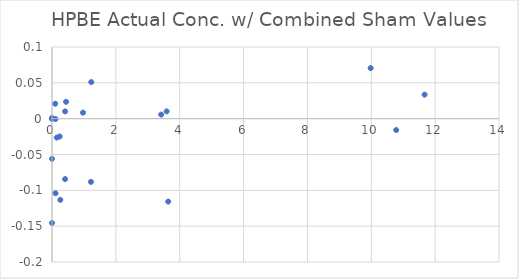
| Category | HPBE Actual Conc. w/ Combined Sham Values |
|---|---|
| 11.67 | 0.034 |
| 3.42 | 0.006 |
| 0.97 | 0.008 |
| 0.41 | 0.01 |
| 0.15 | -0.026 |
| 0.11 | 0 |
| 0.0 | 0 |
| 0.0 | -0.056 |
| 9.98 | 0.071 |
| 3.59 | 0.01 |
| 1.23 | 0.051 |
| 0.44 | 0.024 |
| 0.24 | -0.025 |
| 0.1 | 0.021 |
| 0.0 | 0 |
| 0.0 | 0.001 |
| 10.78 | -0.016 |
| 3.64 | -0.116 |
| 1.22 | -0.088 |
| 0.41 | -0.084 |
| 0.26 | -0.113 |
| 0.11 | -0.104 |
| 0.0 | 0 |
| 0.0 | -0.146 |